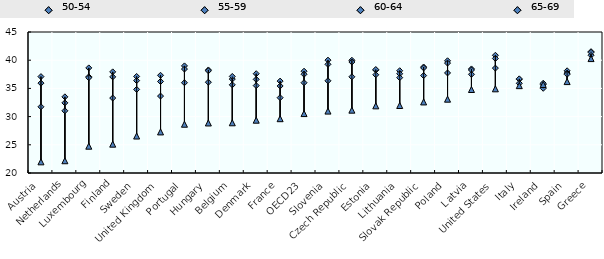
| Category | 50-54 | 55-59 | 60-64 | 65-69 |
|---|---|---|---|---|
| Austria | 37.092 | 35.934 | 31.739 | 21.98 |
| Netherlands | 33.504 | 32.436 | 31.03 | 22.172 |
| Luxembourg | 38.635 | 37.057 | 36.896 | 24.752 |
| Finland | 37.931 | 37.041 | 33.292 | 25.114 |
| Sweden | 37.118 | 36.383 | 34.822 | 26.552 |
| United Kingdom | 37.322 | 36.228 | 33.641 | 27.283 |
| Portugal | 38.99 | 38.431 | 36.007 | 28.648 |
| Hungary | 38.269 | 38.121 | 36.098 | 28.869 |
| Belgium | 36.654 | 35.633 | 37.121 | 28.902 |
| Denmark | 37.604 | 36.6 | 35.5 | 29.363 |
| France | 36.294 | 35.43 | 33.356 | 29.627 |
| OECD23 | 38.047 | 37.509 | 36.008 | 30.537 |
| Slovenia | 40.009 | 39.269 | 36.349 | 30.978 |
| Czech Republic | 39.988 | 39.679 | 37.058 | 31.141 |
| Estonia | 38.246 | 38.351 | 37.421 | 31.906 |
| Lithuania | 38.134 | 37.6 | 36.907 | 31.967 |
| Slovak Republic | 38.794 | 38.632 | 37.275 | 32.597 |
| Poland | 39.897 | 39.487 | 37.74 | 33.088 |
| Latvia | 38.453 | 38.262 | 37.496 | 34.802 |
| United States | 40.873 | 40.309 | 38.6 | 34.927 |
| Italy | 36.611 | 36.693 | 35.903 | 35.489 |
| Ireland | 35.661 | 35.91 | 35.019 | 35.696 |
| Spain | 38.121 | 37.703 | 37.509 | 36.209 |
| Greece | 40.879 | 41.514 | 41.396 | 40.286 |